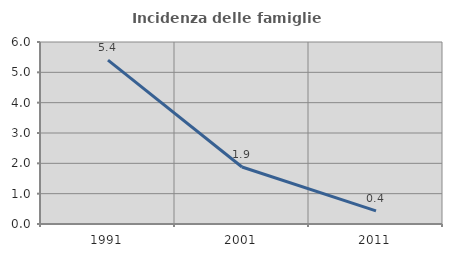
| Category | Incidenza delle famiglie numerose |
|---|---|
| 1991.0 | 5.401 |
| 2001.0 | 1.878 |
| 2011.0 | 0.434 |